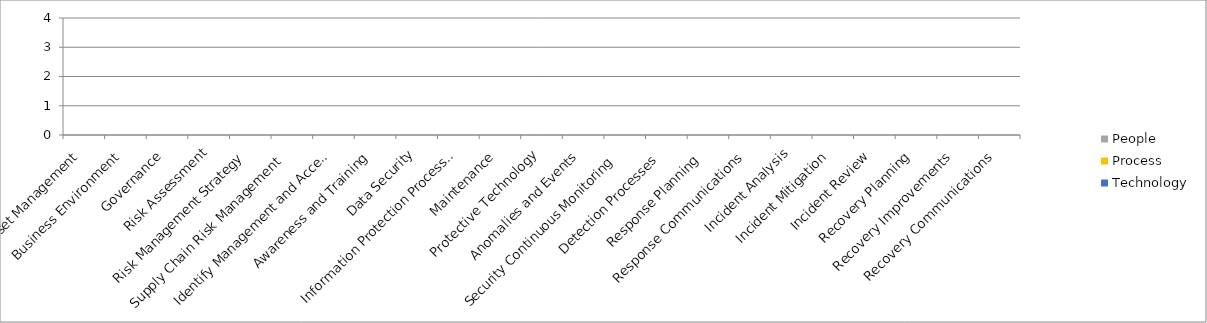
| Category | People | Process | Technology |
|---|---|---|---|
| Asset Management | 0 | 0 | 0 |
| Business Environment | 0 | 0 | 0 |
| Governance | 0 | 0 | 0 |
| Risk Assessment | 0 | 0 | 0 |
| Risk Management Strategy | 0 | 0 | 0 |
| Supply Chain Risk Management  | 0 | 0 | 0 |
| Identify Management and Access Control | 0 | 0 | 0 |
| Awareness and Training | 0 | 0 | 0 |
| Data Security | 0 | 0 | 0 |
| Information Protection Processes | 0 | 0 | 0 |
| Maintenance | 0 | 0 | 0 |
| Protective Technology | 0 | 0 | 0 |
| Anomalies and Events | 0 | 0 | 0 |
| Security Continuous Monitoring  | 0 | 0 | 0 |
| Detection Processes  | 0 | 0 | 0 |
| Response Planning  | 0 | 0 | 0 |
| Response Communications | 0 | 0 | 0 |
| Incident Analysis | 0 | 0 | 0 |
| Incident Mitigation | 0 | 0 | 0 |
| Incident Review | 0 | 0 | 0 |
| Recovery Planning | 0 | 0 | 0 |
| Recovery Improvements | 0 | 0 | 0 |
| Recovery Communications | 0 | 0 | 0 |